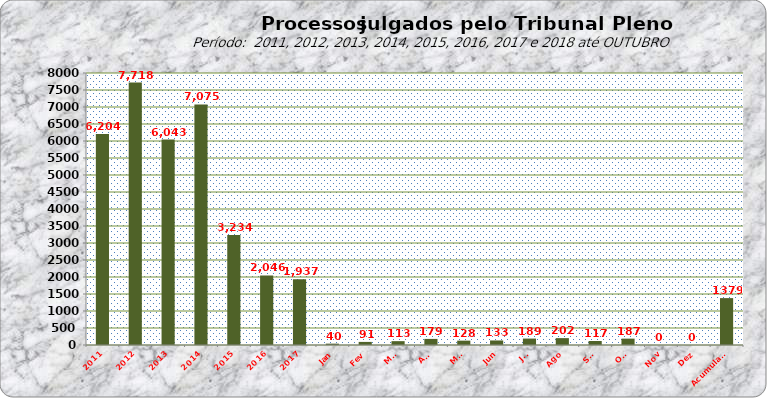
| Category | Series 0 |
|---|---|
| 2011 | 6204 |
| 2012 | 7718 |
| 2013 | 6043 |
| 2014 | 7075 |
| 2015 | 3234 |
| 2016 | 2046 |
| 2017 | 1937 |
| Jan | 40 |
| Fev | 91 |
| Mar | 113 |
| Abr | 179 |
| Mai | 128 |
| Jun | 133 |
| Jul | 189 |
| Ago | 202 |
| Set | 117 |
| Out | 187 |
| Nov | 0 |
| Dez | 0 |
| Acumulado | 1379 |